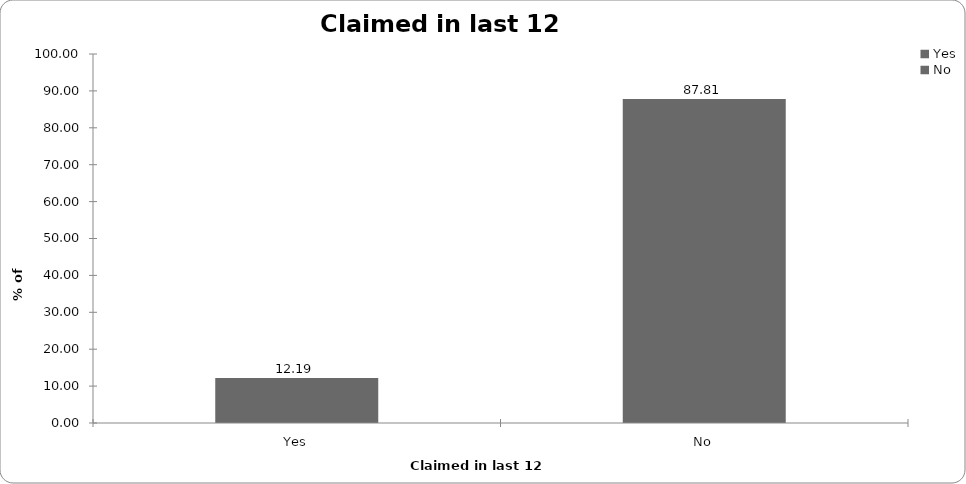
| Category | Claimed in last 12 months |
|---|---|
| Yes | 12.188 |
| No | 87.812 |